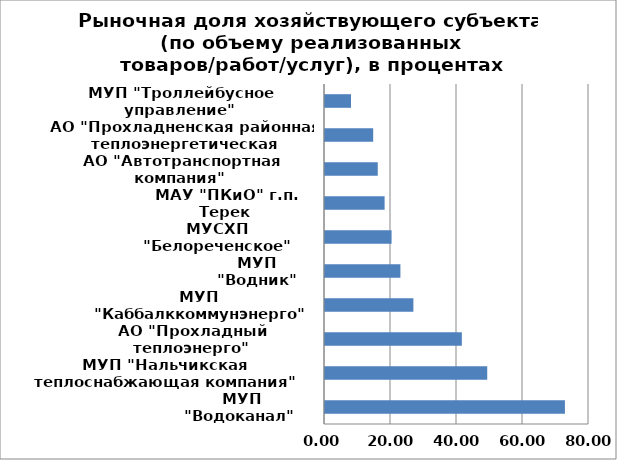
| Category | Series 0 |
|---|---|
| МУП "Водоканал"  | 72.704 |
| МУП "Нальчикская теплоснабжающая компания" | 49.16 |
| АО "Прохладный теплоэнерго" | 41.466 |
| МУП "Каббалккоммунэнерго" | 26.783 |
| МУП "Водник" | 22.851 |
| МУСХП "Белореченское" | 20.175 |
| МАУ "ПКиО" г.п. Терек | 18.062 |
| АО "Автотранспортная компания" | 15.989 |
| АО "Прохладненская районная теплоэнергетическая компания" | 14.602 |
| МУП "Троллейбусное управление" | 7.879 |